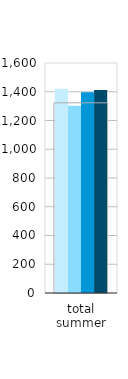
| Category | 2022 | 2023 | 2024 | 2025 |
|---|---|---|---|---|
| total summer | 1420.231 | 1303.47 | 1396.647 | 1411.573 |